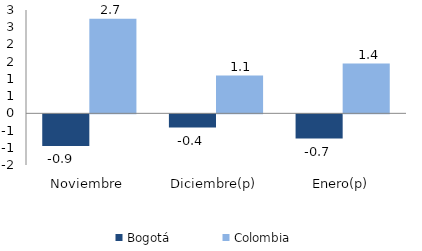
| Category | Bogotá | Colombia |
|---|---|---|
| Noviembre | -0.918 | 2.744 |
| Diciembre(p) | -0.385 | 1.097 |
| Enero(p) | -0.704 | 1.444 |